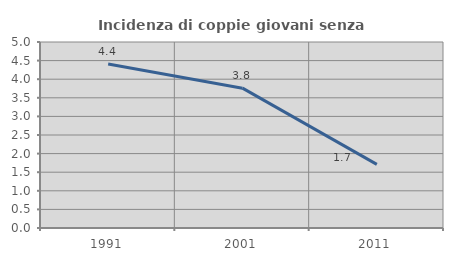
| Category | Incidenza di coppie giovani senza figli |
|---|---|
| 1991.0 | 4.409 |
| 2001.0 | 3.759 |
| 2011.0 | 1.709 |